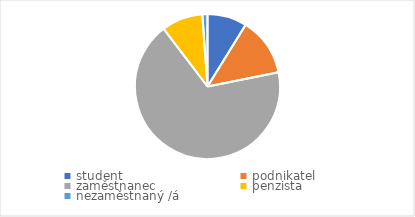
| Category | Series 0 |
|---|---|
| student | 23 |
| podnikatel | 34 |
| zaměstnanec | 177 |
| penzista | 24 |
| nezaměstnaný /á | 3 |